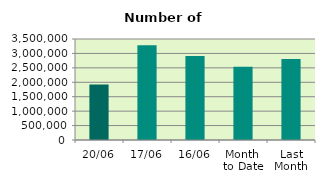
| Category | Series 0 |
|---|---|
| 20/06 | 1919892 |
| 17/06 | 3282958 |
| 16/06 | 2912742 |
| Month 
to Date | 2535145 |
| Last
Month | 2808947.182 |